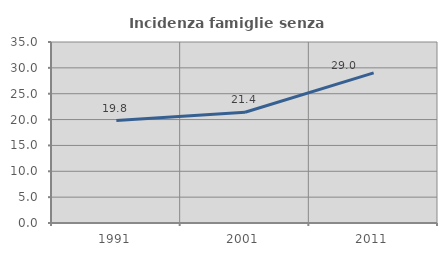
| Category | Incidenza famiglie senza nuclei |
|---|---|
| 1991.0 | 19.805 |
| 2001.0 | 21.418 |
| 2011.0 | 29.034 |